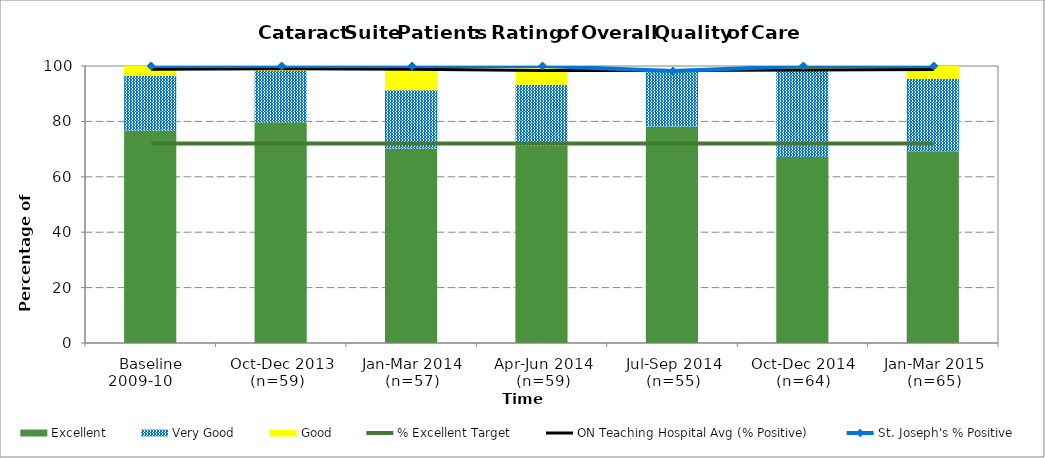
| Category | Excellent | Very Good | Good |
|---|---|---|---|
| Baseline 2009-10      | 76.68 | 19.75 | 3.57 |
| Oct-Dec 2013 (n=59)   | 79.66 | 18.64 | 1.69 |
| Jan-Mar 2014 (n=57) | 70.18 | 21.05 | 8.77 |
| Apr-Jun 2014 (n=59) | 71.19 | 22.03 | 6.78 |
| Jul-Sep 2014 (n=55) | 78.18 | 20 | 0 |
| Oct-Dec 2014 (n=64) | 67.19 | 31.25 | 1.56 |
| Jan-Mar 2015 (n=65) | 69.23 | 26.15 | 4.62 |